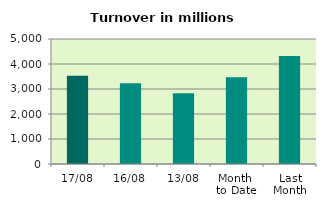
| Category | Series 0 |
|---|---|
| 17/08 | 3527.398 |
| 16/08 | 3227.102 |
| 13/08 | 2828.706 |
| Month 
to Date | 3468.004 |
| Last
Month | 4319.965 |